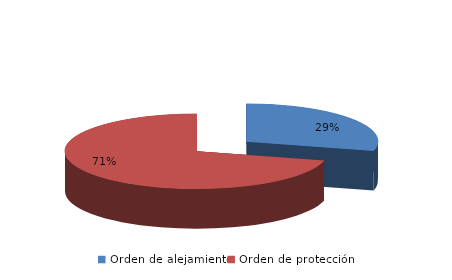
| Category | Series 0 |
|---|---|
| Orden de alejamiento | 448 |
| Orden de protección | 1097 |